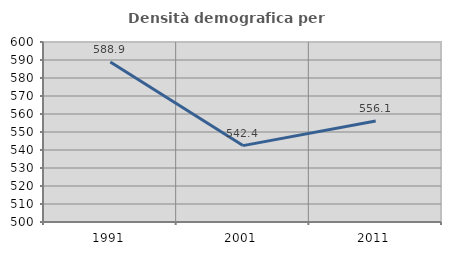
| Category | Densità demografica |
|---|---|
| 1991.0 | 588.935 |
| 2001.0 | 542.442 |
| 2011.0 | 556.121 |